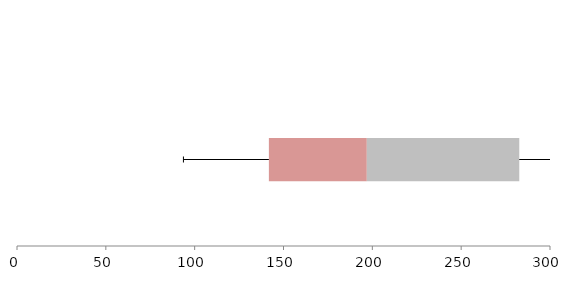
| Category | Series 1 | Series 2 | Series 3 |
|---|---|---|---|
| 0 | 141.771 | 55.124 | 85.816 |